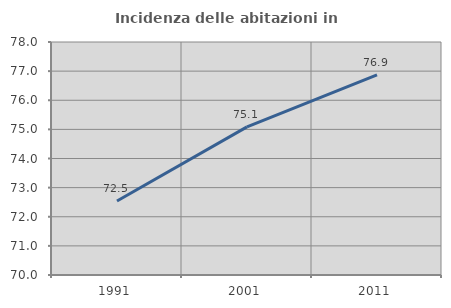
| Category | Incidenza delle abitazioni in proprietà  |
|---|---|
| 1991.0 | 72.542 |
| 2001.0 | 75.086 |
| 2011.0 | 76.869 |